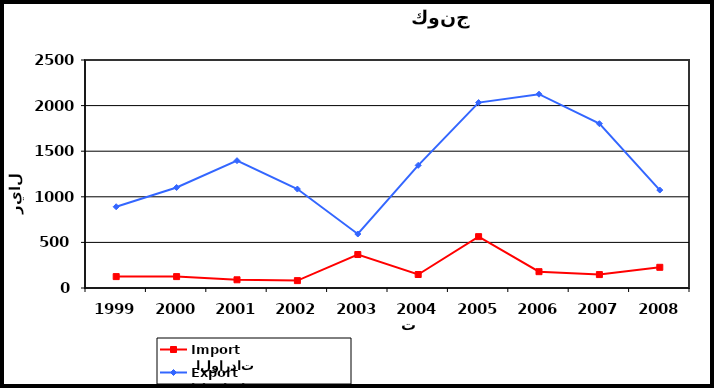
| Category |  الواردات           Import | الصادرات          Export |
|---|---|---|
| 1999.0 | 125 | 891 |
| 2000.0 | 125 | 1102 |
| 2001.0 | 90 | 1396 |
| 2002.0 | 81 | 1085 |
| 2003.0 | 367 | 592 |
| 2004.0 | 148 | 1345 |
| 2005.0 | 563 | 2033 |
| 2006.0 | 179 | 2125 |
| 2007.0 | 147 | 1802 |
| 2008.0 | 227 | 1074 |